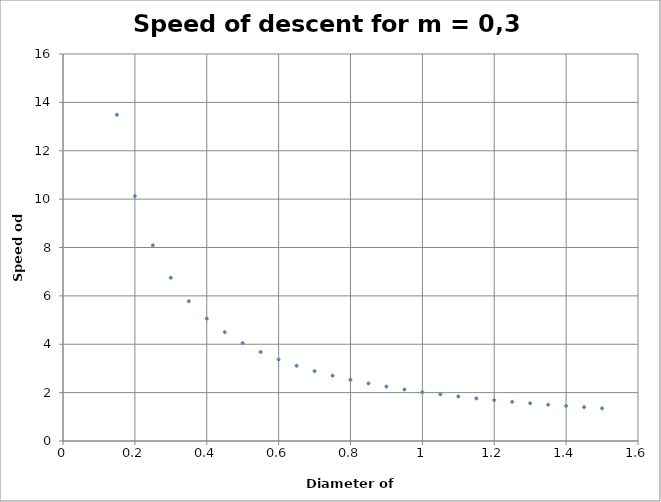
| Category | Series 0 |
|---|---|
| 0.15 | 13.49 |
| 0.2 | 10.12 |
| 0.25 | 8.09 |
| 0.3 | 6.75 |
| 0.35 | 5.78 |
| 0.4 | 5.06 |
| 0.45 | 4.5 |
| 0.5 | 4.05 |
| 0.55 | 3.68 |
| 0.6 | 3.37 |
| 0.65 | 3.11 |
| 0.7 | 2.89 |
| 0.75 | 2.7 |
| 0.8 | 2.53 |
| 0.85 | 2.38 |
| 0.9 | 2.25 |
| 0.95 | 2.13 |
| 1.0 | 2.02 |
| 1.05 | 1.93 |
| 1.1 | 1.84 |
| 1.15 | 1.76 |
| 1.2 | 1.69 |
| 1.25 | 1.62 |
| 1.3 | 1.56 |
| 1.35 | 1.5 |
| 1.4 | 1.45 |
| 1.45 | 1.4 |
| 1.5 | 1.35 |